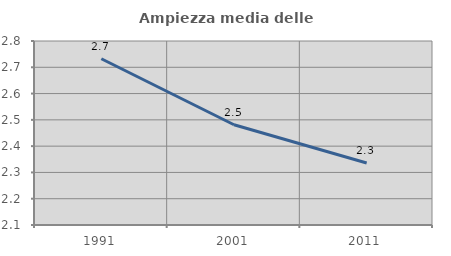
| Category | Ampiezza media delle famiglie |
|---|---|
| 1991.0 | 2.732 |
| 2001.0 | 2.481 |
| 2011.0 | 2.336 |